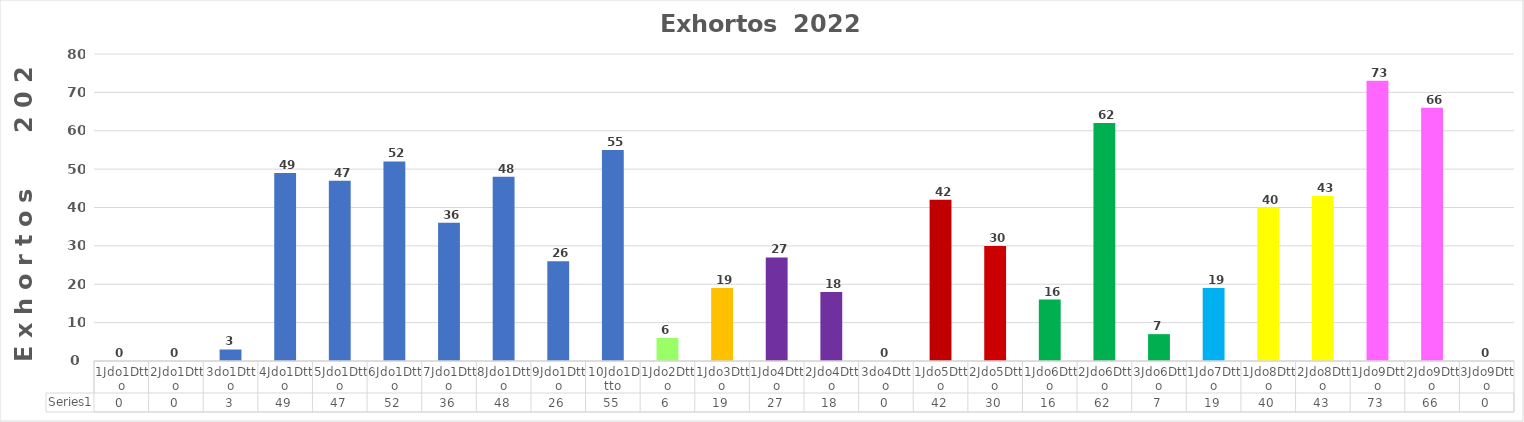
| Category | Series 0 |
|---|---|
| 1Jdo1Dtto | 0 |
| 2Jdo1Dtto | 0 |
| 3do1Dtto | 3 |
| 4Jdo1Dtto | 49 |
| 5Jdo1Dtto | 47 |
| 6Jdo1Dtto | 52 |
| 7Jdo1Dtto | 36 |
| 8Jdo1Dtto | 48 |
| 9Jdo1Dtto | 26 |
| 10Jdo1Dtto | 55 |
| 1Jdo2Dtto | 6 |
| 1Jdo3Dtto | 19 |
| 1Jdo4Dtto | 27 |
| 2Jdo4Dtto | 18 |
| 3do4Dtto | 0 |
| 1Jdo5Dtto | 42 |
| 2Jdo5Dtto | 30 |
| 1Jdo6Dtto | 16 |
| 2Jdo6Dtto | 62 |
| 3Jdo6Dtto | 7 |
| 1Jdo7Dtto | 19 |
| 1Jdo8Dtto | 40 |
| 2Jdo8Dtto | 43 |
| 1Jdo9Dtto | 73 |
| 2Jdo9Dtto | 66 |
| 3Jdo9Dtto | 0 |